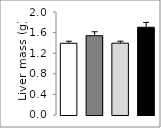
| Category | Series 0 |
|---|---|
| 0 | 1.393 |
| 1 | 1.54 |
| 2 | 1.395 |
| 3 | 1.704 |